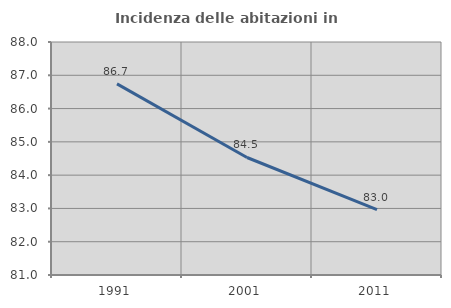
| Category | Incidenza delle abitazioni in proprietà  |
|---|---|
| 1991.0 | 86.74 |
| 2001.0 | 84.53 |
| 2011.0 | 82.967 |